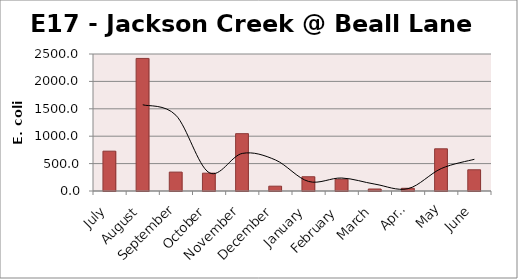
| Category | E. coli MPN |
|---|---|
| July | 727 |
| August | 2419.2 |
| September | 344.8 |
| October | 325.5 |
| November | 1046.2 |
| December | 88 |
| January | 260.2 |
| February | 214.2 |
| March | 36.4 |
| April | 49.6 |
| May | 770.1 |
| June | 387.3 |